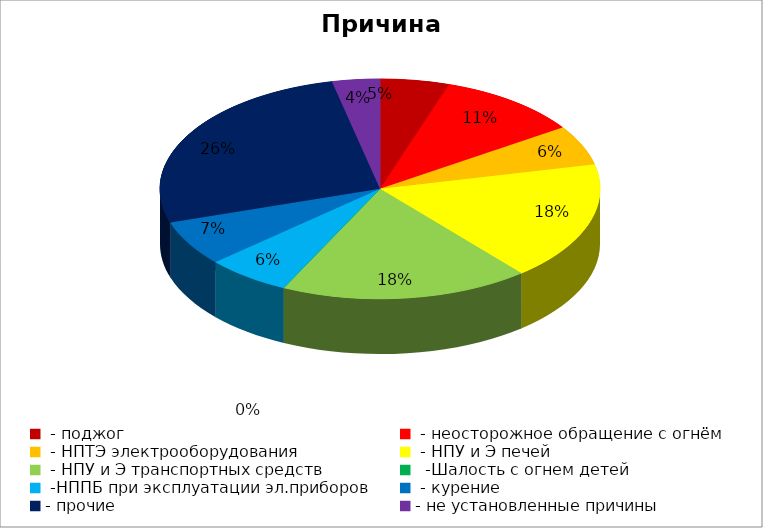
| Category | Причина пожара |
|---|---|
|  - поджог | 13 |
|  - неосторожное обращение с огнём | 27 |
|  - НПТЭ электрооборудования | 15 |
|  - НПУ и Э печей | 45 |
|  - НПУ и Э транспортных средств | 47 |
|   -Шалость с огнем детей | 0 |
|  -НППБ при эксплуатации эл.приборов | 16 |
|  - курение | 17 |
| - прочие | 68 |
| - не установленные причины | 9 |